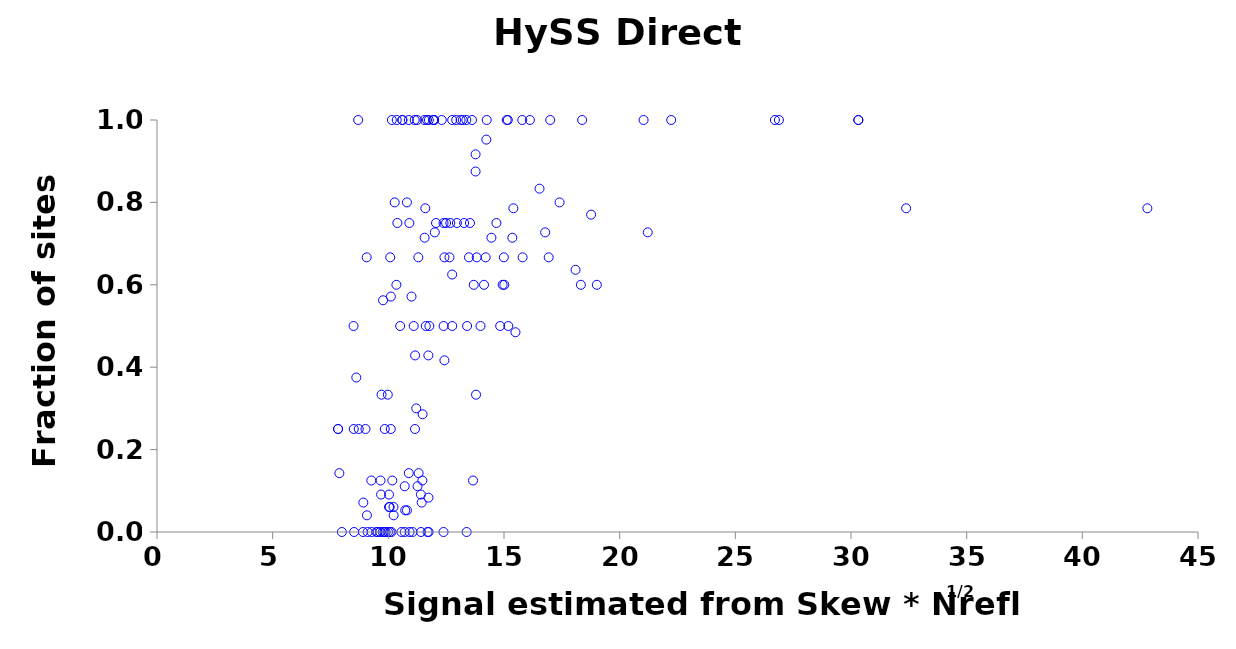
| Category | Direct Methods |
|---|---|
| 8.904423616349154 | 0 |
| 8.697779380210141 | 1 |
| 9.490647882077923 | 0 |
| 11.69665930433824 | 0 |
| 10.61395477967016 | 1 |
| 11.67437006889784 | 1 |
| 12.75921391640042 | 1 |
| 8.519405599906985 | 0 |
| 14.99408381330375 | 0.667 |
| 13.79139357298274 | 0.333 |
| 15.80422534693586 | 0.667 |
| 10.5662667504456 | 0 |
| 9.707329122124598 | 0.333 |
| 9.276760472811382 | 0 |
| 10.15364060634909 | 1 |
| 9.065034967838178 | 0.667 |
| 12.42437950123569 | 0.667 |
| 10.59803504403967 | 1 |
| 14.20822433235694 | 0.667 |
| 15.78884685155215 | 1 |
| 10.08083246321323 | 0.667 |
| 12.64375299802683 | 0.667 |
| 13.82094859272609 | 0.667 |
| 9.01276312959254 | 0.25 |
| 10.13446585180813 | 0 |
| 8.505853469729152 | 0.25 |
| 11.15258093204675 | 0.25 |
| 13.3848942580256 | 0 |
| 13.98501219083193 | 0.5 |
| 15.18565855112216 | 0.5 |
| 13.4051020735917 | 0.5 |
| 8.496951660820404 | 0.5 |
| 11.61949482452974 | 0.5 |
| 7.991362741169836 | 0 |
| 10.39043603432543 | 0.75 |
| 13.21805657730685 | 1 |
| 10.88406218606673 | 1 |
| 10.90831949223794 | 0.75 |
| 10.10576290935441 | 0.25 |
| 12.31190734769541 | 1 |
| 10.51160764154887 | 0.5 |
| 15.117508678916 | 1 |
| 12.3867081237443 | 0.75 |
| 13.61614012944304 | 1 |
| 11.56444198989172 | 1 |
| 11.13865208767545 | 1 |
| 13.12428348411071 | 1 |
| 11.24529489072077 | 1 |
| 12.06207263584719 | 0.75 |
| 9.105141277861739 | 0 |
| 14.94178827098643 | 0.6 |
| 15.01218793287842 | 0.6 |
| 11.04763088644734 | 0 |
| 13.69254316214084 | 0.6 |
| 10.34816997622093 | 0.6 |
| 10.27594534583927 | 0.8 |
| 10.36356455425851 | 1 |
| 10.80424595395253 | 0.8 |
| 10.07148182700858 | 0 |
| 11.7414384666823 | 0 |
| 18.3229925056957 | 0.6 |
| 13.37029120660925 | 1 |
| 21.03348661658102 | 1 |
| 18.37953512487878 | 1 |
| 11.98042953754751 | 1 |
| 12.93250887685302 | 1 |
| 11.75005773778657 | 1 |
| 15.1656378020641 | 1 |
| 14.25431250377948 | 1 |
| 16.12065665419265 | 1 |
| 26.88516868191811 | 1 |
| 30.31668974773338 | 1 |
| 30.31668974773338 | 1 |
| 22.22701883082318 | 1 |
| 26.71186286510515 | 1 |
| 11.30941761137824 | 0.143 |
| 10.11125425174311 | 0.571 |
| 10.88440971373654 | 0.143 |
| 11.0023760359028 | 0.571 |
| 11.48205771043878 | 0.286 |
| 11.7294332340968 | 0.429 |
| 9.264325964957472 | 0.125 |
| 10.17146151040151 | 0.125 |
| 7.82663791389178 | 0.25 |
| 9.84590194615479 | 0.25 |
| 7.82663791389178 | 0.25 |
| 8.719594013921085 | 0.25 |
| 16.99925644037305 | 1 |
| 12.38544287893745 | 0 |
| 10.91794895541963 | 0 |
| 12.76281264826931 | 0.5 |
| 9.66353755373613 | 0.125 |
| 8.615462146521535 | 0.375 |
| 10.70942612555771 | 0 |
| 9.648180022666667 | 0 |
| 11.97675695996634 | 1 |
| 9.756517079438307 | 0 |
| 12.38843447677363 | 0.5 |
| 11.41135324289504 | 0 |
| 11.4707798607688 | 0.125 |
| 9.986333684675731 | 0 |
| 13.77161248434936 | 0.875 |
| 11.93981694361301 | 1 |
| 9.8835487959365 | 0 |
| 14.67264207937377 | 0.75 |
| 9.83022552525119 | 0 |
| 13.48533281163613 | 0.667 |
| 11.29667671994353 | 0.667 |
| 16.93229603251613 | 0.667 |
| 11.2064337999266 | 0.3 |
| 9.540444998563824 | 0 |
| 11.7734186167464 | 0.5 |
| 14.13630382894294 | 0.6 |
| 11.09651690554001 | 0.5 |
| 19.01367070708936 | 0.6 |
| 17.40306304519538 | 0.8 |
| 14.83491115172147 | 0.5 |
| 10.02803867466331 | 0.091 |
| 11.40863957851593 | 0.091 |
| 12.00851427840937 | 0.727 |
| 18.09307497944226 | 0.636 |
| 21.21430984948792 | 0.727 |
| 13.77187742688815 | 0.917 |
| 13.27655468752768 | 0.75 |
| 12.49476554361105 | 0.75 |
| 11.73375921710938 | 0.083 |
| 12.42360379729368 | 0.417 |
| 12.9640258385667 | 0.75 |
| 12.6788838197101 | 0.75 |
| 7.883049817296589 | 0.143 |
| 11.44292679262981 | 0.071 |
| 8.918744279058181 | 0.071 |
| 11.15741080555995 | 0.429 |
| 11.59790984904862 | 0.786 |
| 15.36054339189891 | 0.714 |
| 15.40492305384931 | 0.786 |
| 11.56903976710047 | 0.714 |
| 32.3823694555138 | 0.786 |
| 49.60898652610788 | 0.786 |
| 42.81027626999855 | 0.786 |
| 12.75886077509668 | 0.625 |
| 13.66107270546395 | 0.125 |
| 9.772040746966333 | 0.562 |
| 13.52906309898512 | 0.75 |
| 16.53601177869234 | 0.833 |
| 48.31470237056254 | 0.833 |
| 14.45629138103512 | 0.714 |
| 14.23632654399194 | 0.952 |
| 9.686537533060166 | 0.091 |
| 16.77948982679185 | 0.727 |
| 10.70722373944662 | 0.111 |
| 9.976641804549624 | 0.333 |
| 11.26279669842417 | 0.111 |
| 10.22254344480292 | 0.061 |
| 10.02888090151726 | 0.061 |
| 15.49638509411768 | 0.485 |
| 10.80663247533288 | 0.053 |
| 10.72943764009707 | 0.053 |
| 10.05964283486379 | 0.061 |
| 10.22839330216725 | 0.041 |
| 9.076096373048316 | 0.041 |
| 18.76489398002018 | 0.77 |